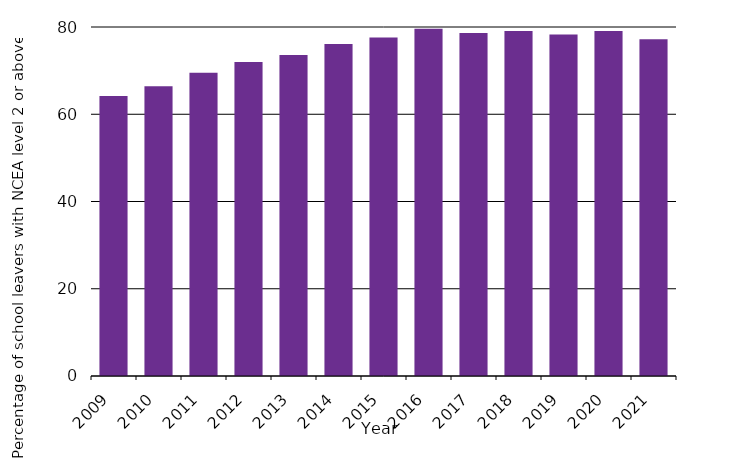
| Category | Percentage of school leavers with NCEA level 2 or above |
|---|---|
| 2009.0 | 64.209 |
| 2010.0 | 66.4 |
| 2011.0 | 69.5 |
| 2012.0 | 72 |
| 2013.0 | 73.6 |
| 2014.0 | 76.1 |
| 2015.0 | 77.6 |
| 2016.0 | 79.6 |
| 2017.0 | 78.6 |
| 2018.0 | 79.1 |
| 2019.0 | 78.3 |
| 2020.0 | 79.1 |
| 2021.0 | 77.2 |